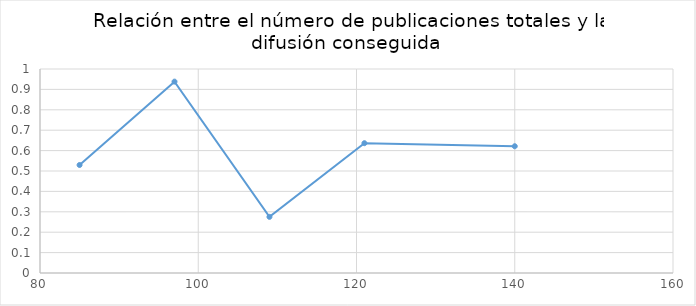
| Category | Series 0 |
|---|---|
| 140.0 | 0.621 |
| 121.0 | 0.636 |
| 109.0 | 0.275 |
| 97.0 | 0.938 |
| 85.0 | 0.529 |